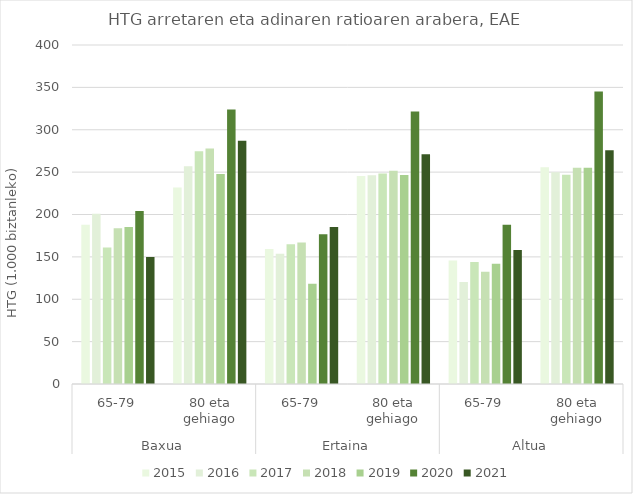
| Category | 2015 | 2016 | 2017 | 2018 | 2019 | 2020 | 2021 |
|---|---|---|---|---|---|---|---|
| 0 | 187.891 | 200.803 | 161.002 | 183.673 | 185.366 | 204.214 | 149.813 |
| 1 | 231.894 | 256.799 | 274.533 | 277.762 | 247.691 | 323.83 | 287.013 |
| 2 | 159.271 | 153.661 | 164.985 | 167.059 | 118.436 | 176.796 | 185.25 |
| 3 | 245.483 | 246.337 | 248.336 | 251.563 | 246.608 | 321.577 | 271.088 |
| 4 | 145.865 | 120.34 | 143.977 | 132.328 | 141.849 | 187.877 | 158.2 |
| 5 | 255.86 | 249.844 | 246.814 | 255.291 | 255.118 | 345.225 | 275.672 |